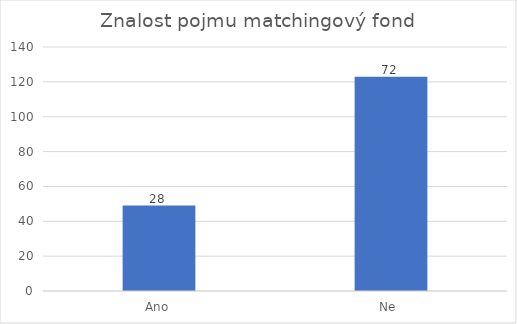
| Category | Počet respondentů |
|---|---|
| Ano | 49 |
| Ne  | 123 |